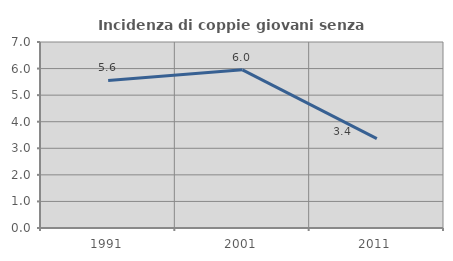
| Category | Incidenza di coppie giovani senza figli |
|---|---|
| 1991.0 | 5.556 |
| 2001.0 | 5.952 |
| 2011.0 | 3.363 |